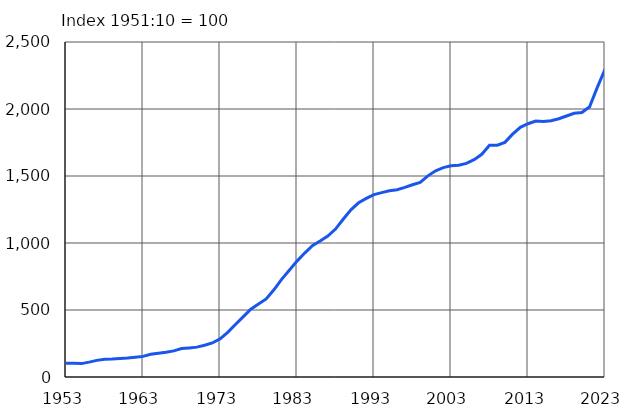
| Category | 1951:10 = 100 |
|---|---|
| 1953.0 | 103 |
| 1954.0 | 103 |
| 1955.0 | 100 |
| 1956.0 | 111 |
| 1957.0 | 124 |
| 1958.0 | 132 |
| 1959.0 | 134 |
| 1960.0 | 138 |
| 1961.0 | 141 |
| 1962.0 | 147 |
| 1963.0 | 154 |
| 1964.0 | 170 |
| 1965.0 | 178 |
| 1966.0 | 185 |
| 1967.0 | 195 |
| 1968.0 | 212 |
| 1969.0 | 217 |
| 1970.0 | 223 |
| 1971.0 | 237 |
| 1972.0 | 254 |
| 1973.0 | 284 |
| 1974.0 | 333 |
| 1975.0 | 392 |
| 1976.0 | 449 |
| 1977.0 | 506 |
| 1978.0 | 544 |
| 1979.0 | 583 |
| 1980.0 | 651 |
| 1981.0 | 729 |
| 1982.0 | 797 |
| 1983.0 | 865 |
| 1984.0 | 925 |
| 1985.0 | 980 |
| 1986.0 | 1015 |
| 1987.0 | 1052 |
| 1988.0 | 1104 |
| 1989.0 | 1177 |
| 1990.0 | 1248 |
| 1991.0 | 1300 |
| 1992.0 | 1333 |
| 1993.0 | 1361 |
| 1994.0 | 1376 |
| 1995.0 | 1390 |
| 1996.0 | 1398 |
| 1997.0 | 1415 |
| 1998.0 | 1435 |
| 1999.0 | 1452 |
| 2000.0 | 1501 |
| 2001.0 | 1539 |
| 2002.0 | 1563 |
| 2003.0 | 1577 |
| 2004.0 | 1580 |
| 2005.0 | 1594 |
| 2006.0 | 1622 |
| 2007.0 | 1662 |
| 2008.0 | 1730 |
| 2009.0 | 1730 |
| 2010.0 | 1751 |
| 2011.0 | 1812 |
| 2012.0 | 1863 |
| 2013.0 | 1890 |
| 2014.0 | 1910 |
| 2015.0 | 1906 |
| 2016.0 | 1913 |
| 2017.0 | 1927 |
| 2018.0 | 1948 |
| 2019.0 | 1968 |
| 2020.0 | 1974 |
| 2021.0 | 2017 |
| 2022.0 | 2161 |
| 2023.0 | 2296 |